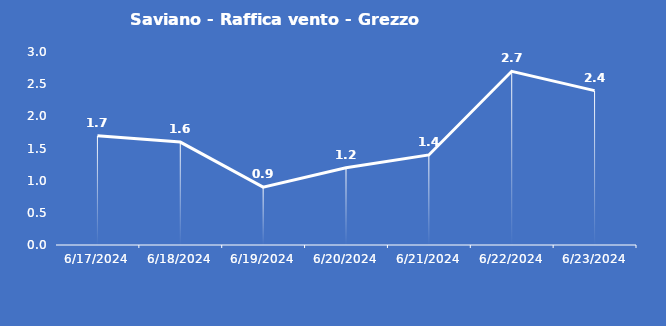
| Category | Saviano - Raffica vento - Grezzo (m/s) |
|---|---|
| 6/17/24 | 1.7 |
| 6/18/24 | 1.6 |
| 6/19/24 | 0.9 |
| 6/20/24 | 1.2 |
| 6/21/24 | 1.4 |
| 6/22/24 | 2.7 |
| 6/23/24 | 2.4 |